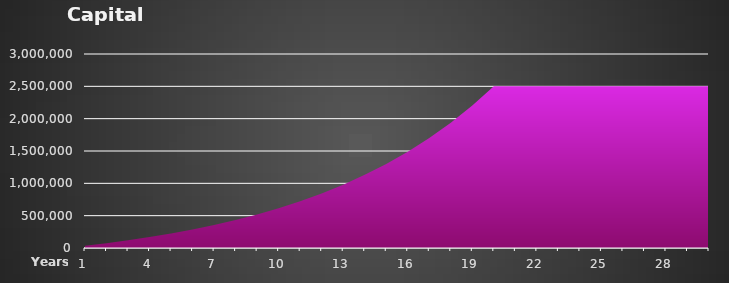
| Category | Capital Repayment |
|---|---|
| 0 | 35310.71 |
| 1 | 74805.242 |
| 2 | 118979.321 |
| 3 | 168387.407 |
| 4 | 223649.656 |
| 5 | 285459.705 |
| 6 | 354593.375 |
| 7 | 431918.413 |
| 8 | 518405.381 |
| 9 | 615139.838 |
| 10 | 723335.968 |
| 11 | 844351.818 |
| 12 | 979706.344 |
| 13 | 1131098.479 |
| 14 | 1300428.452 |
| 15 | 1489821.645 |
| 16 | 1701655.269 |
| 17 | 1938588.199 |
| 18 | 2203594.348 |
| 19 | 2500000 |
| 20 | 2500000 |
| 21 | 2500000 |
| 22 | 2500000 |
| 23 | 2500000 |
| 24 | 2500000 |
| 25 | 2500000 |
| 26 | 2500000 |
| 27 | 2500000 |
| 28 | 2500000 |
| 29 | 2500000 |